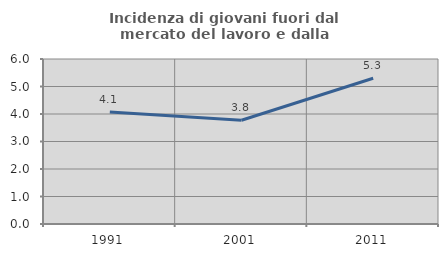
| Category | Incidenza di giovani fuori dal mercato del lavoro e dalla formazione  |
|---|---|
| 1991.0 | 4.069 |
| 2001.0 | 3.774 |
| 2011.0 | 5.3 |